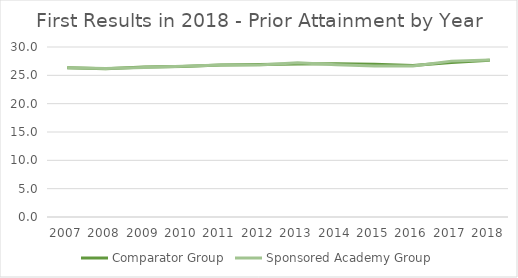
| Category | Comparator Group | Sponsored Academy Group |
|---|---|---|
| 2007.0 | 26.358 | 26.325 |
| 2008.0 | 26.163 | 26.223 |
| 2009.0 | 26.45 | 26.374 |
| 2010.0 | 26.543 | 26.604 |
| 2011.0 | 26.828 | 26.816 |
| 2012.0 | 26.925 | 26.819 |
| 2013.0 | 26.998 | 27.201 |
| 2014.0 | 27.037 | 26.859 |
| 2015.0 | 26.968 | 26.636 |
| 2016.0 | 26.746 | 26.64 |
| 2017.0 | 27.283 | 27.508 |
| 2018.0 | 27.671 | 27.688 |